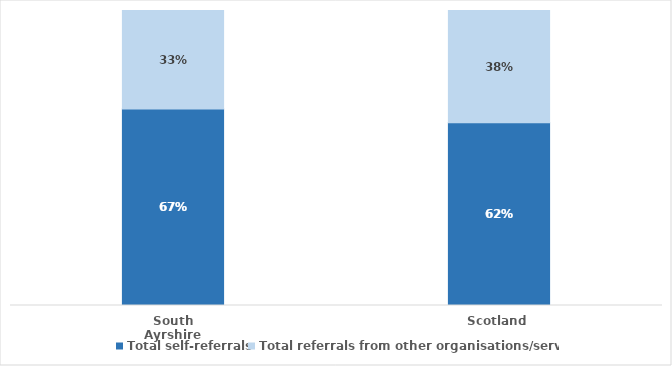
| Category | Total self-referrals | Total referrals from other organisations/services |
|---|---|---|
| South Ayrshire | 0.666 | 0.334 |
| Scotland | 0.619 | 0.381 |